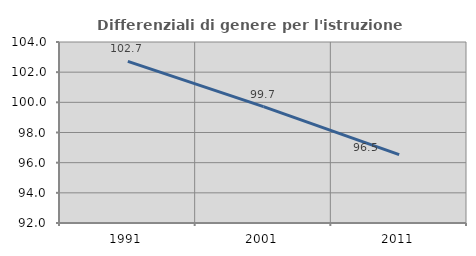
| Category | Differenziali di genere per l'istruzione superiore |
|---|---|
| 1991.0 | 102.719 |
| 2001.0 | 99.72 |
| 2011.0 | 96.539 |